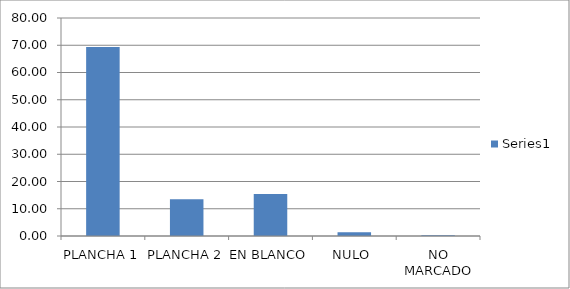
| Category | Series 0 |
|---|---|
| PLANCHA 1 | 69.382 |
| PLANCHA 2 | 13.483 |
| EN BLANCO | 15.449 |
| NULO  | 1.404 |
| NO MARCADO | 0.281 |